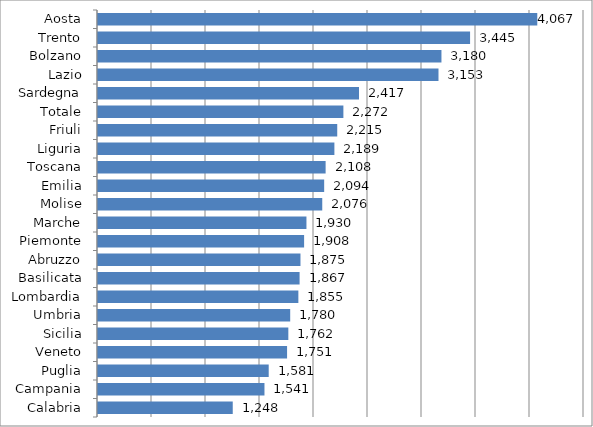
| Category | Series 0 |
|---|---|
| Aosta | 4067.305 |
| Trento | 3445.136 |
| Bolzano | 3180.104 |
| Lazio | 3152.684 |
| Sardegna | 2416.656 |
| Totale | 2272.079 |
| Friuli | 2215.112 |
| Liguria | 2188.834 |
| Toscana | 2107.575 |
| Emilia | 2094.161 |
| Molise | 2076.438 |
| Marche | 1930.063 |
| Piemonte | 1908.42 |
| Abruzzo | 1874.744 |
| Basilicata | 1866.64 |
| Lombardia | 1855.228 |
| Umbria | 1779.587 |
| Sicilia | 1762.367 |
| Veneto | 1750.677 |
| Puglia | 1580.613 |
| Campania | 1541.345 |
| Calabria | 1247.682 |